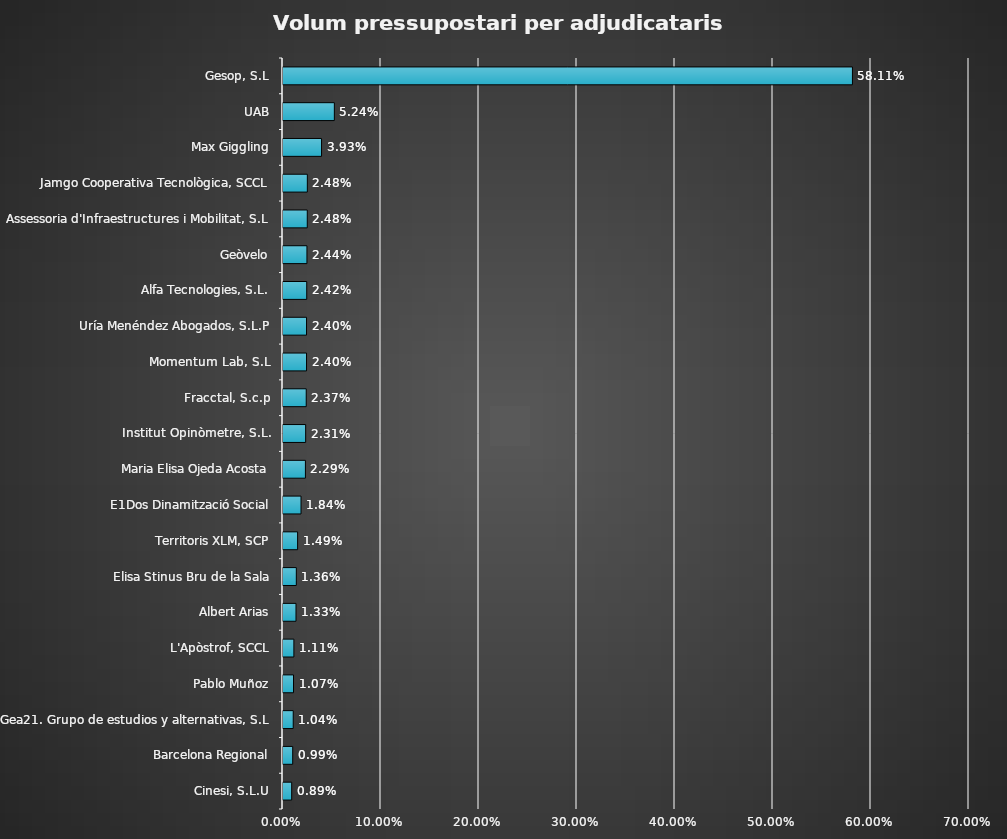
| Category | Series 0 |
|---|---|
| Cinesi, S.L.U | 0.009 |
| Barcelona Regional | 0.01 |
| Gea21. Grupo de estudios y alternativas, S.L | 0.01 |
| Pablo Muñoz | 0.011 |
| L'Apòstrof, SCCL | 0.011 |
| Albert Arias | 0.013 |
| Elisa Stinus Bru de la Sala | 0.014 |
| Territoris XLM, SCP | 0.015 |
| E1Dos Dinamització Social | 0.018 |
| Maria Elisa Ojeda Acosta | 0.023 |
| Institut Opinòmetre, S.L. | 0.023 |
| Fracctal, S.c.p | 0.024 |
| Momentum Lab, S.L | 0.024 |
| Uría Menéndez Abogados, S.L.P | 0.024 |
| Alfa Tecnologies, S.L. | 0.024 |
| Geòvelo | 0.024 |
| Assessoria d'Infraestructures i Mobilitat, S.L | 0.025 |
| Jamgo Cooperativa Tecnològica, SCCL | 0.025 |
| Max Giggling | 0.039 |
| UAB | 0.052 |
| Gesop, S.L | 0.581 |